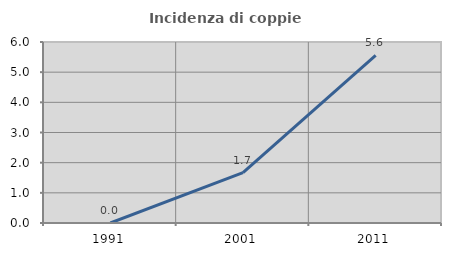
| Category | Incidenza di coppie miste |
|---|---|
| 1991.0 | 0 |
| 2001.0 | 1.667 |
| 2011.0 | 5.556 |